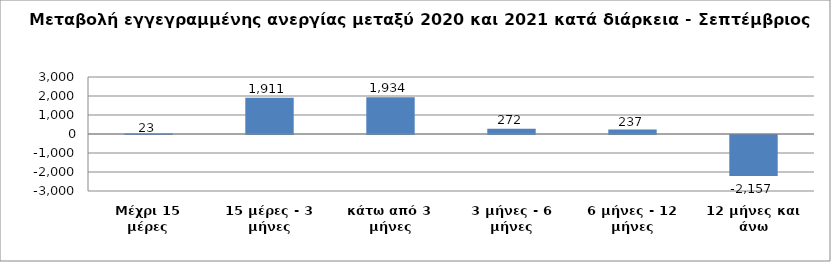
| Category | Series 0 |
|---|---|
| Μέχρι 15 μέρες | 23 |
| 15 μέρες - 3 μήνες | 1911 |
| κάτω από 3 μήνες | 1934 |
| 3 μήνες - 6 μήνες | 272 |
| 6 μήνες - 12 μήνες | 237 |
| 12 μήνες και άνω | -2157 |